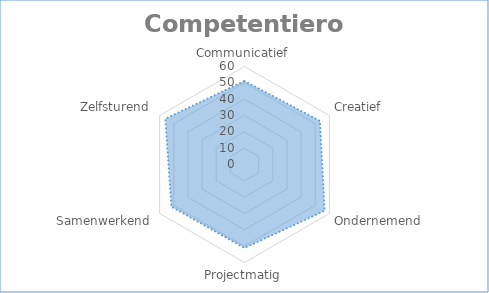
| Category | Series 0 | Series 1 | Series 2 |
|---|---|---|---|
| Communicatief | 51.111 | 0 | 0 |
| Creatief | 53.333 | 0 | 0 |
| Ondernemend | 56.667 | 0 | 0 |
| Projectmatig | 51.111 | 0 | 0 |
| Samenwerkend | 51.667 | 0 | 0 |
| Zelfsturend | 56 | 0 | 0 |